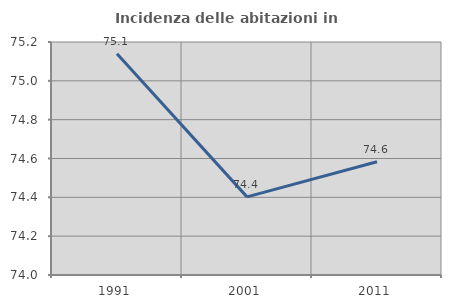
| Category | Incidenza delle abitazioni in proprietà  |
|---|---|
| 1991.0 | 75.14 |
| 2001.0 | 74.402 |
| 2011.0 | 74.583 |